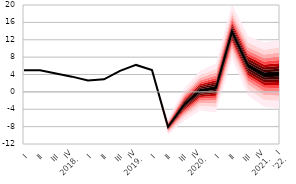
| Category | Series 0 |
|---|---|
| I | 4.965 |
| II | 4.992 |
| III | 4.212 |
| IV
2018 | 3.505 |
| I | 2.609 |
| II | 2.885 |
| III | 4.821 |
| IV
2019 | 6.203 |
| I | 5 |
| II | -8.038 |
| III | -2.99 |
| IV
2020 | 0.297 |
| I | 0.919 |
| II | 13.888 |
| III | 6.016 |
| IV
2021 | 3.957 |
| I
'22 | 4.1 |